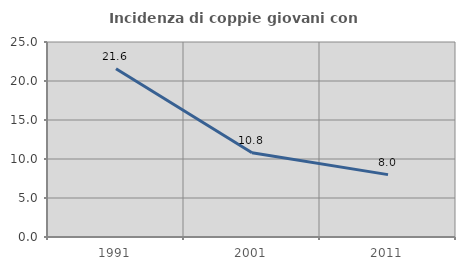
| Category | Incidenza di coppie giovani con figli |
|---|---|
| 1991.0 | 21.567 |
| 2001.0 | 10.798 |
| 2011.0 | 7.998 |